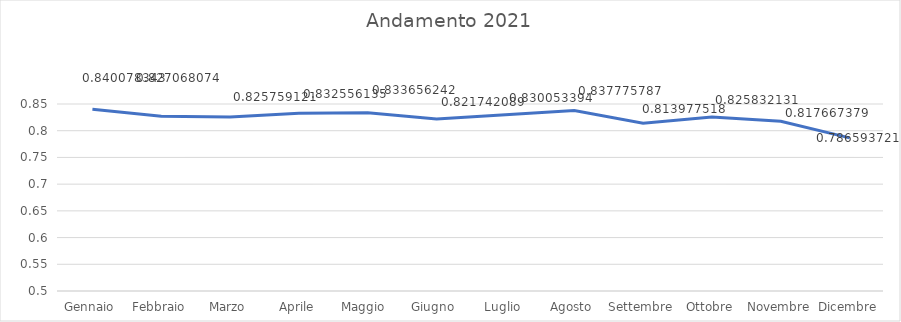
| Category | Percentuale RD |
|---|---|
| Gennaio | 0.84 |
| Febbraio | 0.827 |
| Marzo | 0.826 |
| Aprile | 0.833 |
| Maggio  | 0.834 |
| Giugno  | 0.822 |
| Luglio | 0.83 |
| Agosto | 0.838 |
| Settembre | 0.814 |
| Ottobre | 0.826 |
| Novembre | 0.818 |
| Dicembre | 0.787 |